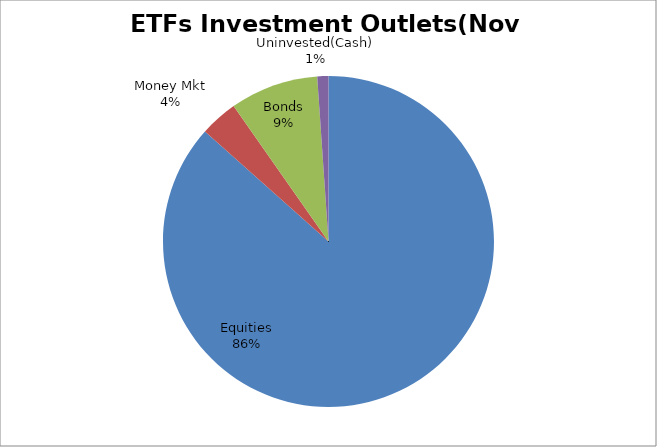
| Category | Series 0 |
|---|---|
| Equities | 4511471490.81 |
| Money Mkt | 192561506.44 |
| Bonds | 449623716.37 |
| Uninvested(Cash) | 56722794.06 |